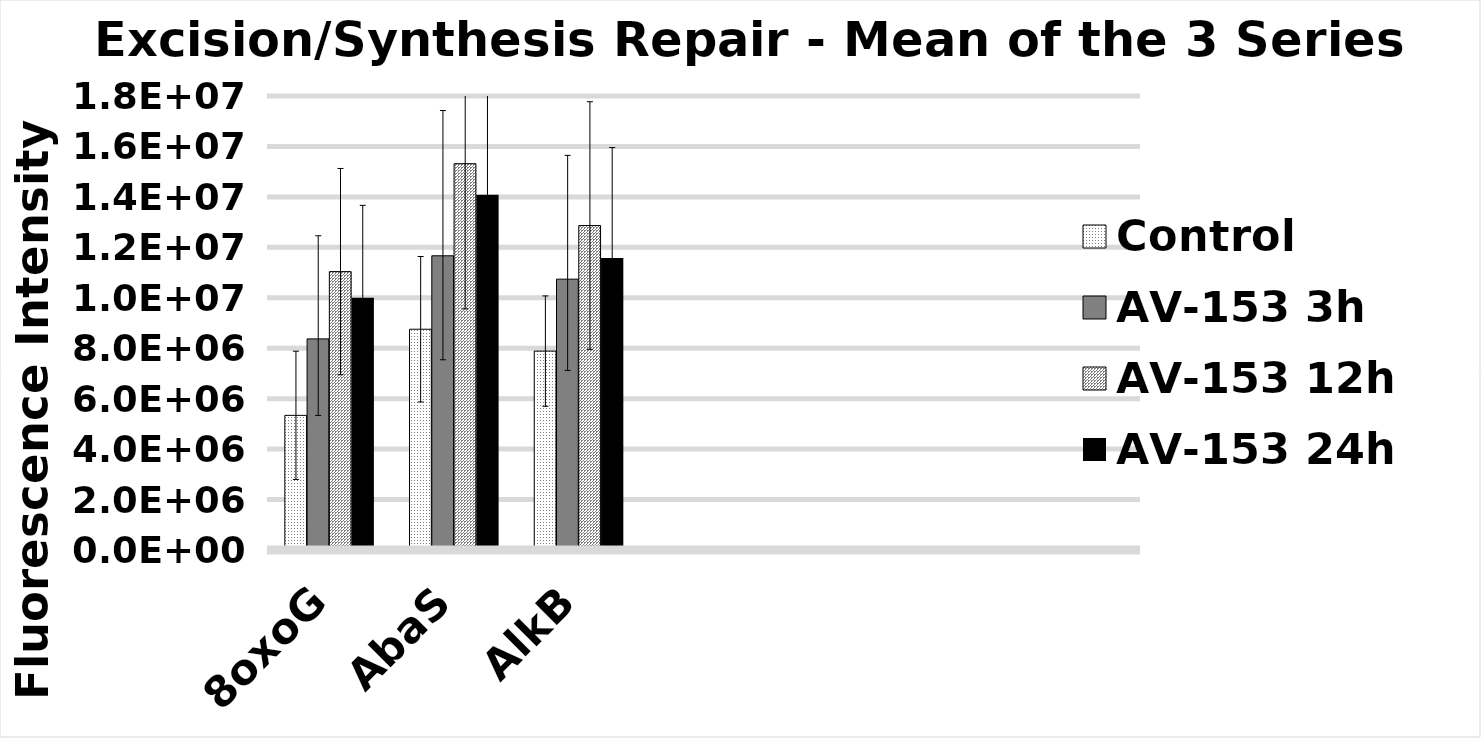
| Category | Control | AV-153 3h  | AV-153 12h  | AV-153 24h  |
|---|---|---|---|---|
| 8oxoG | 5337770.667 | 8370266 | 11037718.333 | 10002981 |
| AbaS | 8753230.167 | 11664979.167 | 15316415 | 14082833 |
| AlkB | 7885738.5 | 10738470.167 | 12864779.833 | 11572490.667 |